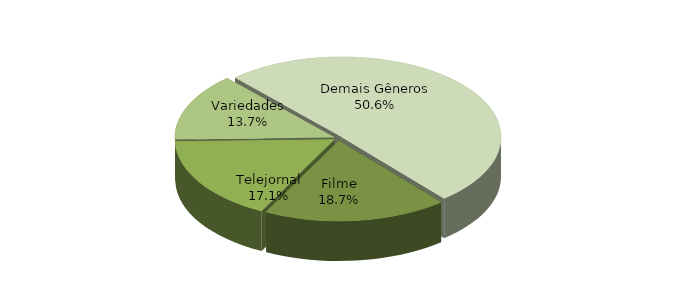
| Category | Series 0 |
|---|---|
| Filme | 0.187 |
| Telejornal | 0.171 |
| Variedades | 0.137 |
| Demais Gêneros | 0.506 |